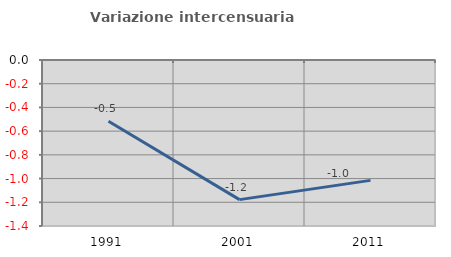
| Category | Variazione intercensuaria annua |
|---|---|
| 1991.0 | -0.517 |
| 2001.0 | -1.177 |
| 2011.0 | -1.015 |